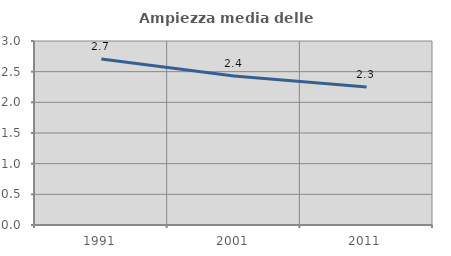
| Category | Ampiezza media delle famiglie |
|---|---|
| 1991.0 | 2.707 |
| 2001.0 | 2.428 |
| 2011.0 | 2.251 |